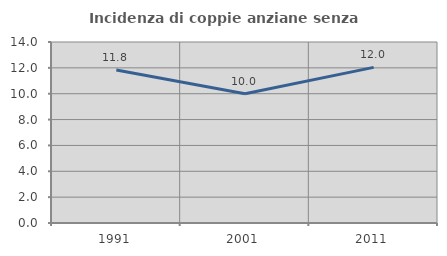
| Category | Incidenza di coppie anziane senza figli  |
|---|---|
| 1991.0 | 11.828 |
| 2001.0 | 10 |
| 2011.0 | 12.037 |